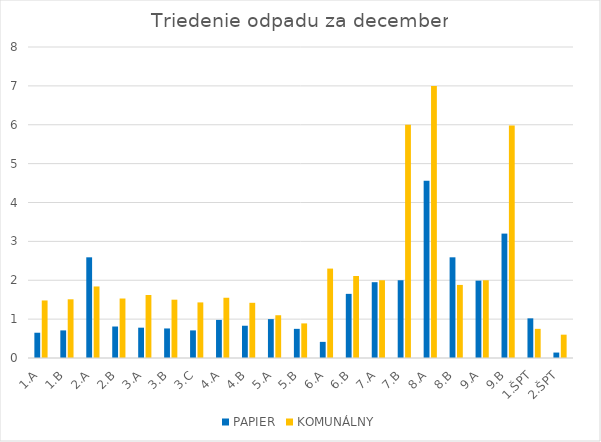
| Category | PAPIER | KOMUNÁLNY |
|---|---|---|
| 1.A | 0.65 | 1.48 |
| 1.B | 0.71 | 1.51 |
| 2.A | 2.59 | 1.84 |
| 2.B | 0.81 | 1.53 |
| 3.A | 0.78 | 1.62 |
| 3.B | 0.76 | 1.5 |
| 3.C | 0.71 | 1.43 |
| 4.A | 0.98 | 1.55 |
| 4.B | 0.83 | 1.42 |
| 5.A | 1 | 1.1 |
| 5.B | 0.75 | 0.89 |
| 6.A | 0.415 | 2.3 |
| 6.B | 1.65 | 2.11 |
| 7.A | 1.95 | 2 |
| 7.B | 2 | 6 |
| 8.A | 4.56 | 7 |
| 8.B | 2.59 | 1.88 |
| 9.A | 1.99 | 2 |
| 9.B | 3.2 | 5.98 |
| 1.ŠPT | 1.02 | 0.75 |
| 2.ŠPT | 0.14 | 0.6 |